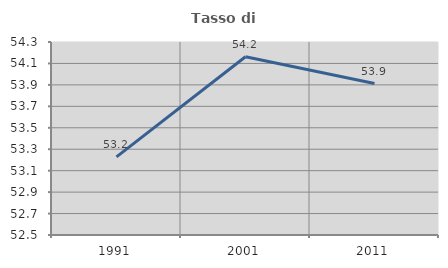
| Category | Tasso di occupazione   |
|---|---|
| 1991.0 | 53.228 |
| 2001.0 | 54.162 |
| 2011.0 | 53.913 |